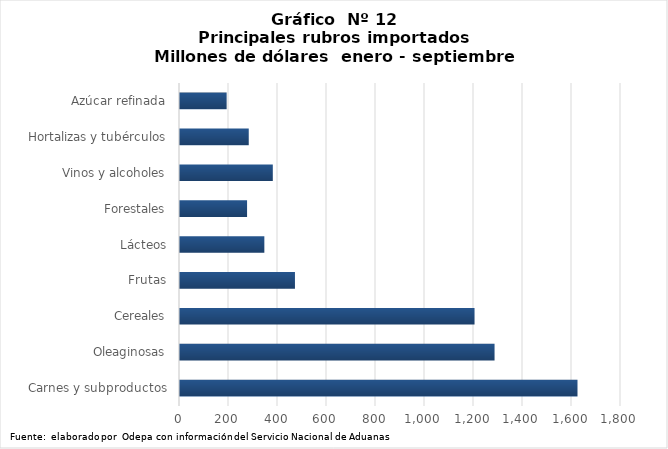
| Category | Series 0 |
|---|---|
| Carnes y subproductos | 1622420.097 |
| Oleaginosas | 1283900.581 |
| Cereales | 1202203.094 |
| Frutas | 469206.896 |
| Lácteos | 344278.755 |
| Forestales | 273763 |
| Vinos y alcoholes | 378801.849 |
| Hortalizas y tubérculos | 280608.628 |
| Azúcar refinada | 190354.356 |